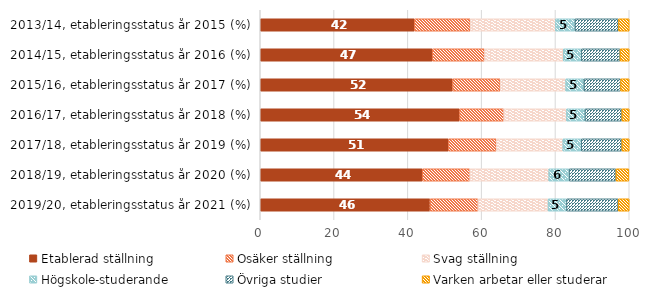
| Category | Etablerad ställning | Osäker ställning | Svag ställning | Högskole-studerande | Övriga studier | Varken arbetar eller studerar |
|---|---|---|---|---|---|---|
| 2019/20, etableringsstatus år 2021 (%) | 46 | 13 | 19 | 5 | 14 | 3 |
| 2018/19, etableringsstatus år 2020 (%) | 43.9 | 12.9 | 21.4 | 5.5 | 12.7 | 3.5 |
| 2017/18, etableringsstatus år 2019 (%) | 51 | 13 | 18 | 5 | 11 | 3 |
| 2016/17, etableringsstatus år 2018 (%) | 54 | 12 | 17 | 5 | 10 | 2 |
| 2015/16, etableringsstatus år 2017 (%) | 52.12 | 12.92 | 17.73 | 4.93 | 9.96 | 2.33 |
| 2014/15, etableringsstatus år 2016 (%) | 46.61 | 14.18 | 21.33 | 4.9 | 10.49 | 2.49 |
| 2013/14, etableringsstatus år 2015 (%) | 41.76 | 15.2 | 23.05 | 5.26 | 11.82 | 2.91 |